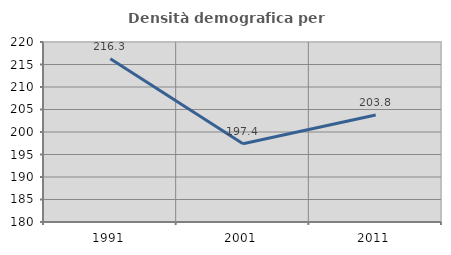
| Category | Densità demografica |
|---|---|
| 1991.0 | 216.257 |
| 2001.0 | 197.406 |
| 2011.0 | 203.766 |